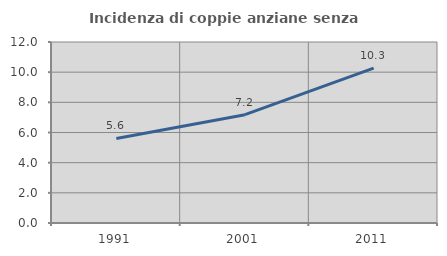
| Category | Incidenza di coppie anziane senza figli  |
|---|---|
| 1991.0 | 5.609 |
| 2001.0 | 7.182 |
| 2011.0 | 10.27 |